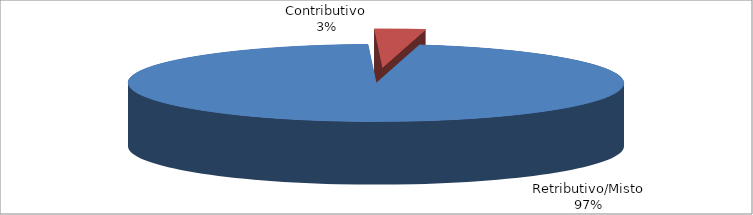
| Category | Decorrenti ANNO 2021 |
|---|---|
| Retributivo/Misto | 34652 |
| Contributivo | 1183 |